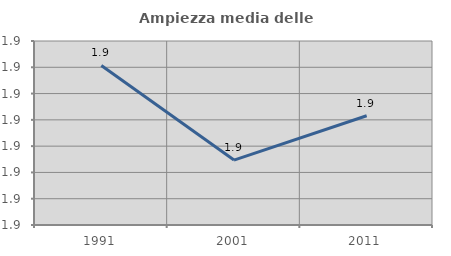
| Category | Ampiezza media delle famiglie |
|---|---|
| 1991.0 | 1.9 |
| 2001.0 | 1.882 |
| 2011.0 | 1.891 |